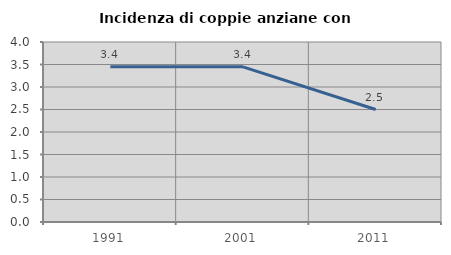
| Category | Incidenza di coppie anziane con figli |
|---|---|
| 1991.0 | 3.448 |
| 2001.0 | 3.448 |
| 2011.0 | 2.5 |